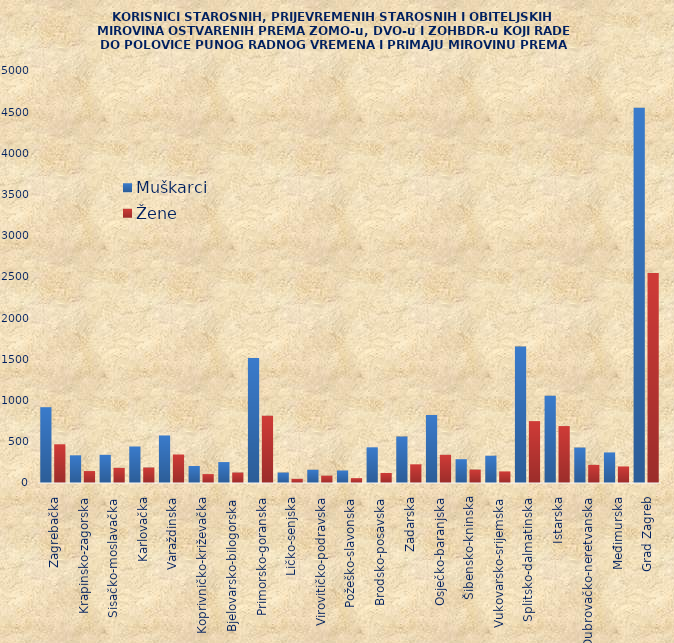
| Category | Muškarci | Žene |
|---|---|---|
| Zagrebačka | 920 | 470 |
| Krapinsko-zagorska | 336 | 145 |
| Sisačko-moslavačka | 342 | 184 |
| Karlovačka | 443 | 188 |
| Varaždinska | 577 | 346 |
| Koprivničko-križevačka | 206 | 108 |
| Bjelovarsko-bilogorska | 254 | 127 |
| Primorsko-goranska | 1517 | 816 |
| Ličko-senjska | 127 | 51 |
| Virovitičko-podravska | 161 | 89 |
| Požeško-slavonska | 152 | 59 |
| Brodsko-posavska | 433 | 122 |
| Zadarska | 564 | 227 |
| Osječko-baranjska | 826 | 342 |
| Šibensko-kninska | 289 | 163 |
| Vukovarsko-srijemska | 331 | 141 |
| Splitsko-dalmatinska | 1656 | 751 |
| Istarska | 1059 | 691 |
| Dubrovačko-neretvanska | 430 | 220 |
| Međimurska | 371 | 201 |
| Grad Zagreb | 4553 | 2549 |